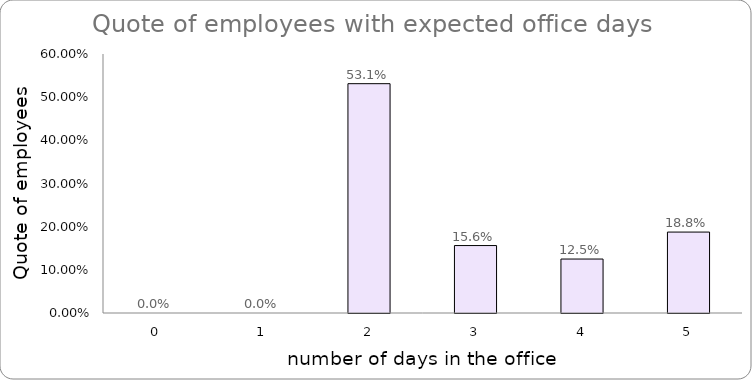
| Category | Series 0 |
|---|---|
| 0.0 | 0 |
| 1.0 | 0 |
| 2.0 | 0.531 |
| 3.0 | 0.156 |
| 4.0 | 0.125 |
| 5.0 | 0.188 |